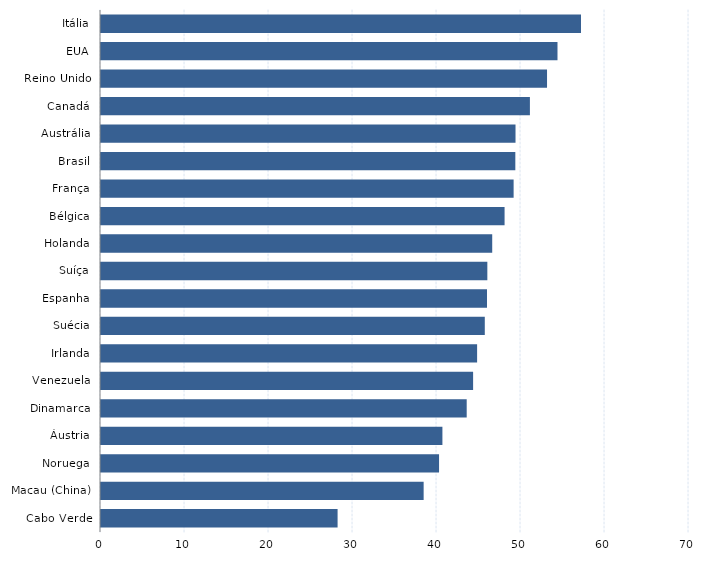
| Category | Series 0 |
|---|---|
| Cabo Verde | 28.165 |
| Macau (China) | 38.409 |
| Noruega | 40.245 |
| Áustria | 40.644 |
| Dinamarca | 43.536 |
| Venezuela | 44.299 |
| Irlanda | 44.775 |
| Suécia | 45.69 |
| Espanha | 45.952 |
| Suíça | 45.993 |
| Holanda | 46.573 |
| Bélgica | 48.045 |
| França | 49.122 |
| Brasil | 49.325 |
| Austrália | 49.347 |
| Canadá | 51.06 |
| Reino Unido | 53.1 |
| EUA | 54.345 |
| Itália | 57.143 |